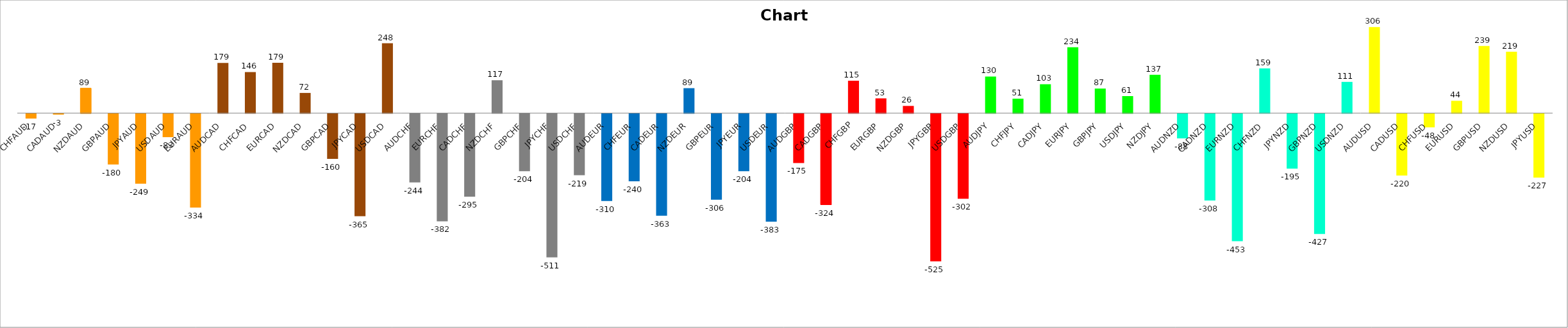
| Category | Series 0 |
|---|---|
| CHFAUD | -17.013 |
| CADAUD | -2.869 |
| NZDAUD | 88.715 |
| GBPAUD | -180.2 |
| JPYAUD | -248.766 |
| USDAUD | -83.141 |
| EURAUD | -333.65 |
| AUDCAD | 178.65 |
| CHFCAD | 146.25 |
| EURCAD | 178.95 |
| NZDCAD | 71.8 |
| GBPCAD | -160.35 |
| JPYCAD | -364.514 |
| USDCAD | 248.486 |
| AUDCHF | -244.05 |
| EURCHF | -382.45 |
| CADCHF | -294.924 |
| NZDCHF | 117.083 |
| GBPCHF | -204.05 |
| JPYCHF | -510.714 |
| USDCHF | -218.7 |
| AUDEUR | -309.905 |
| CHFEUR | -240.371 |
| CADEUR | -362.536 |
| NZDEUR | 88.805 |
| GBPEUR | -305.633 |
| JPYEUR | -204.084 |
| USDEUR | -383.317 |
| AUDGBP | -175.116 |
| CADGBP | -324.306 |
| CHFGBP | 115.077 |
| EURGBP | 52.55 |
| NZDGBP | 25.632 |
| JPYGBP | -525.012 |
| USDGBP | -302.186 |
| AUDJPY | 130.3 |
| CHFJPY | 51.45 |
| CADJPY | 102.75 |
| EURJPY | 234.25 |
| GBPJPY | 87.35 |
| USDJPY | 60.65 |
| NZDJPY | 136.6 |
| AUDNZD | -87.55 |
| CADNZD | -308.398 |
| EURNZD | -453.25 |
| CHFNZD | 159 |
| JPYNZD | -195.324 |
| GBPNZD | -427.3 |
| USDNZD | 111.127 |
| AUDUSD | 306.15 |
| CADUSD | -219.75 |
| CHFUSD | -48.197 |
| EURUSD | 43.85 |
| GBPUSD | 238.65 |
| NZDUSD | 218.55 |
| JPYUSD | -227.18 |